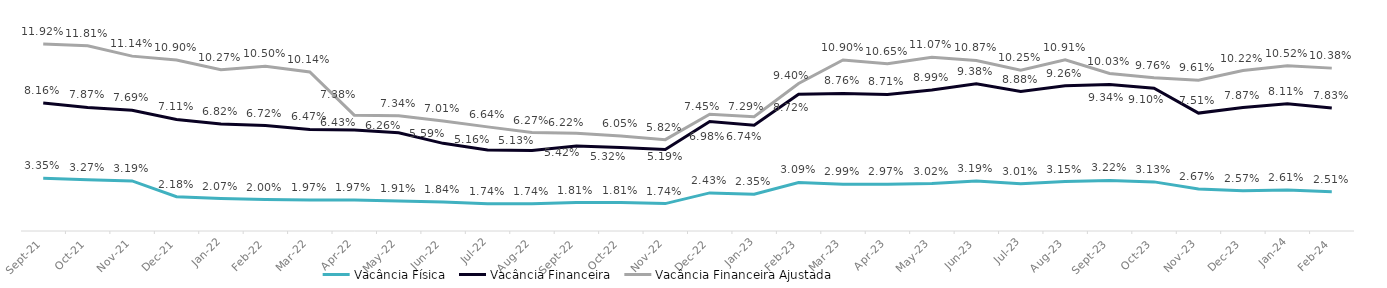
| Category | Vacância Física | Vacância Financeira | Vacância Financeira Ajustada |
|---|---|---|---|
| 2021-09-01 | 0.034 | 0.082 | 0.119 |
| 2021-10-01 | 0.033 | 0.079 | 0.118 |
| 2021-11-01 | 0.032 | 0.077 | 0.111 |
| 2021-12-01 | 0.022 | 0.071 | 0.109 |
| 2022-01-01 | 0.021 | 0.068 | 0.103 |
| 2022-02-01 | 0.02 | 0.067 | 0.105 |
| 2022-03-01 | 0.02 | 0.065 | 0.101 |
| 2022-04-01 | 0.02 | 0.064 | 0.074 |
| 2022-05-01 | 0.019 | 0.063 | 0.073 |
| 2022-06-01 | 0.018 | 0.056 | 0.07 |
| 2022-07-31 | 0.017 | 0.052 | 0.066 |
| 2022-08-31 | 0.017 | 0.051 | 0.063 |
| 2022-09-01 | 0.018 | 0.054 | 0.062 |
| 2022-10-01 | 0.018 | 0.053 | 0.061 |
| 2022-11-01 | 0.017 | 0.052 | 0.058 |
| 2022-12-01 | 0.024 | 0.07 | 0.074 |
| 2023-01-01 | 0.023 | 0.067 | 0.073 |
| 2023-02-01 | 0.031 | 0.087 | 0.094 |
| 2023-03-01 | 0.03 | 0.088 | 0.109 |
| 2023-04-01 | 0.03 | 0.087 | 0.107 |
| 2023-05-01 | 0.03 | 0.09 | 0.111 |
| 2023-06-01 | 0.032 | 0.094 | 0.109 |
| 2023-07-01 | 0.03 | 0.089 | 0.102 |
| 2023-08-01 | 0.032 | 0.093 | 0.109 |
| 2023-09-01 | 0.032 | 0.093 | 0.1 |
| 2023-10-01 | 0.031 | 0.091 | 0.098 |
| 2023-11-01 | 0.027 | 0.075 | 0.096 |
| 2023-12-01 | 0.026 | 0.079 | 0.102 |
| 2024-01-01 | 0.026 | 0.081 | 0.105 |
| 2024-02-01 | 0.025 | 0.078 | 0.104 |